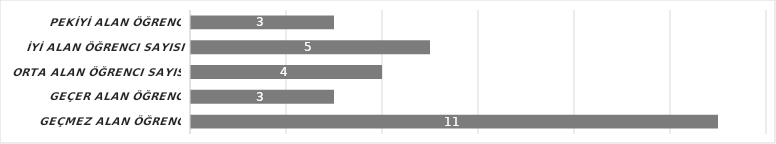
| Category | Series 6 |
|---|---|
| GEÇMEZ alan öğrenci sayısı | 11 |
| GEÇER alan öğrenci sayısı | 3 |
| ORTA alan öğrenci sayısı | 4 |
| İYİ alan öğrenci sayısı | 5 |
| PEKİYİ alan öğrenci sayısı | 3 |